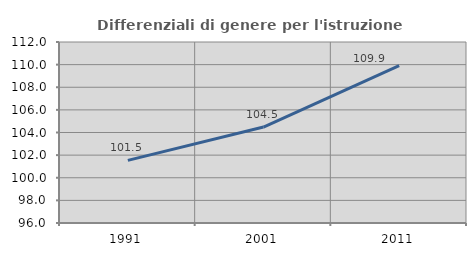
| Category | Differenziali di genere per l'istruzione superiore |
|---|---|
| 1991.0 | 101.536 |
| 2001.0 | 104.481 |
| 2011.0 | 109.908 |